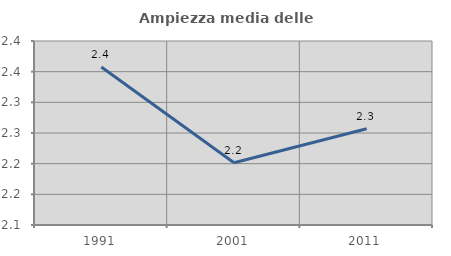
| Category | Ampiezza media delle famiglie |
|---|---|
| 1991.0 | 2.358 |
| 2001.0 | 2.201 |
| 2011.0 | 2.257 |